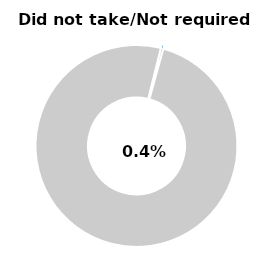
| Category | Series 0 |
|---|---|
| Did not take/not required | 0.004 |
| Other | 0.996 |